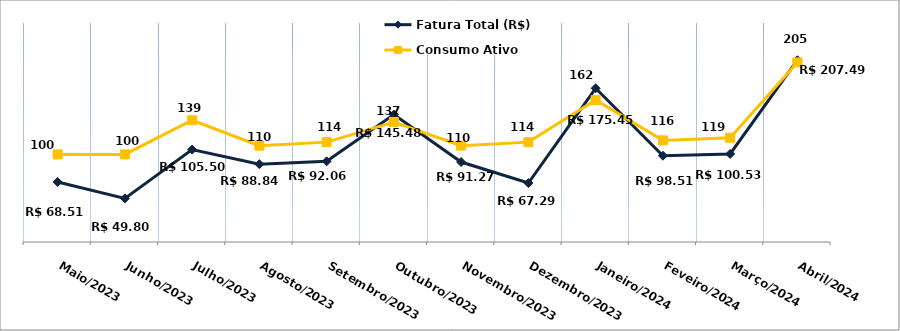
| Category | Fatura Total (R$) |
|---|---|
| Maio/2023 | 68.51 |
| Junho/2023 | 49.8 |
| Julho/2023 | 105.5 |
| Agosto/2023 | 88.84 |
| Setembro/2023 | 92.06 |
| Outubro/2023 | 145.48 |
| Novembro/2023 | 91.27 |
| Dezembro/2023 | 67.29 |
| Janeiro/2024 | 175.45 |
| Feveiro/2024 | 98.51 |
| Março/2024 | 100.53 |
| Abril/2024 | 207.49 |